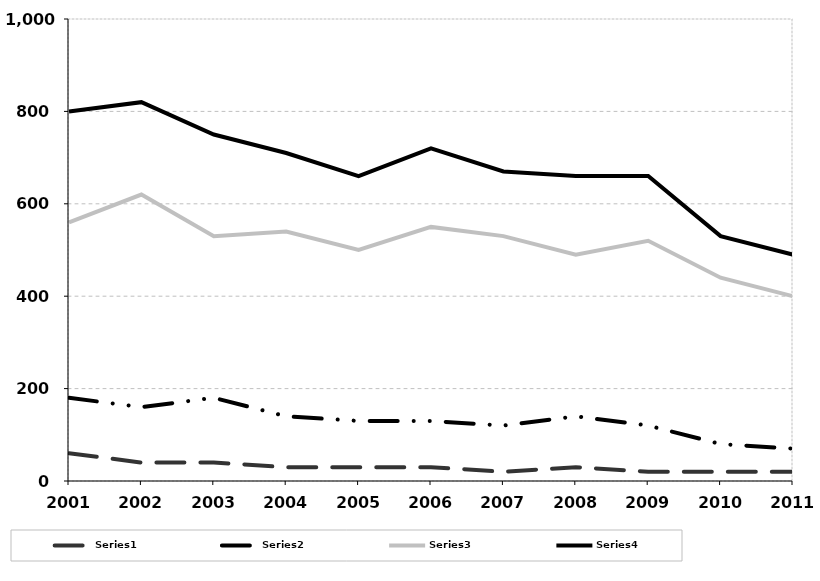
| Category | Series 0 | Series 1 | Series 2 | Series 3 |
|---|---|---|---|---|
| 2001.0 | 60 | 180 | 560 | 800 |
| 2002.0 | 40 | 160 | 620 | 820 |
| 2003.0 | 40 | 180 | 530 | 750 |
| 2004.0 | 30 | 140 | 540 | 710 |
| 2005.0 | 30 | 130 | 500 | 660 |
| 2006.0 | 30 | 130 | 550 | 720 |
| 2007.0 | 20 | 120 | 530 | 670 |
| 2008.0 | 30 | 140 | 490 | 660 |
| 2009.0 | 20 | 120 | 520 | 660 |
| 2010.0 | 20 | 80 | 440 | 530 |
| 2011.0 | 20 | 70 | 400 | 490 |